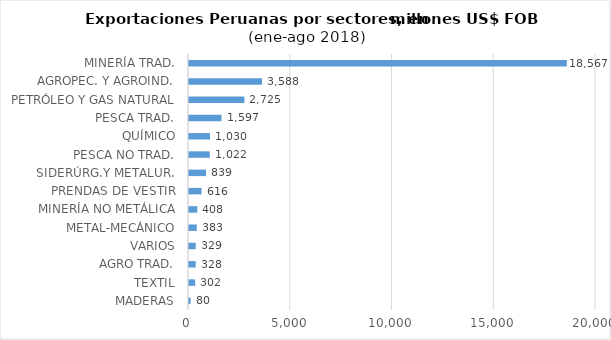
| Category | Series 0 |
|---|---|
| MADERAS | 79.733 |
| TEXTIL | 302.457 |
| AGRO TRAD. | 328.415 |
| VARIOS | 329.382 |
| METAL-MECÁNICO | 382.528 |
| MINERÍA NO METÁLICA | 408.392 |
| PRENDAS DE VESTIR | 616.401 |
| SIDERÚRG.Y METALUR. | 839.48 |
| PESCA NO TRAD. | 1021.65 |
| QUÍMICO | 1030.416 |
| PESCA TRAD. | 1597.347 |
| PETRÓLEO Y GAS NATURAL | 2724.575 |
| AGROPEC. Y AGROIND. | 3588.252 |
| MINERÍA TRAD. | 18566.957 |